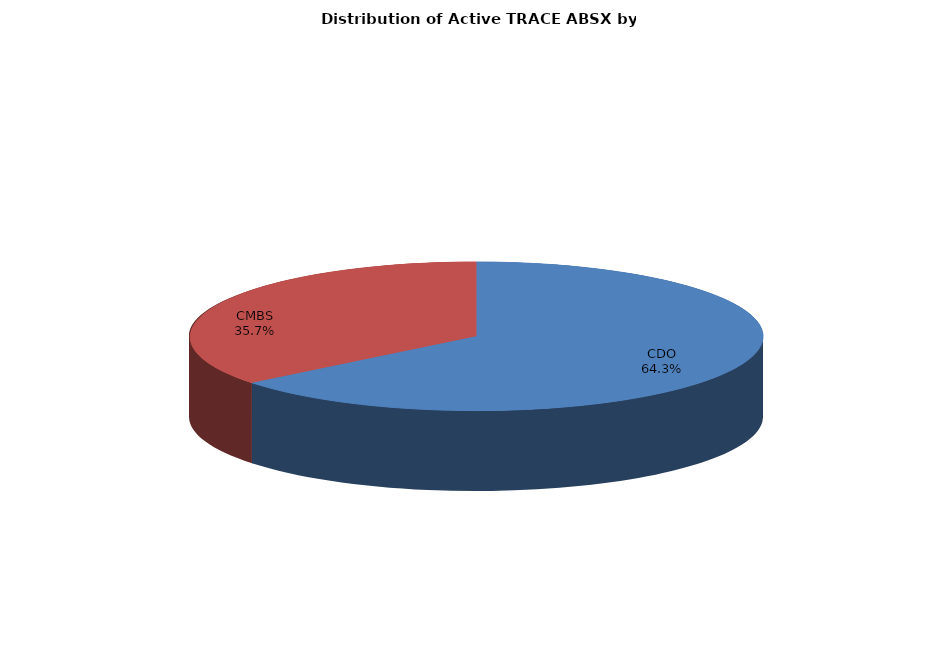
| Category | Series 0 |
|---|---|
| CDO | 55867 |
| CMBS | 31077 |